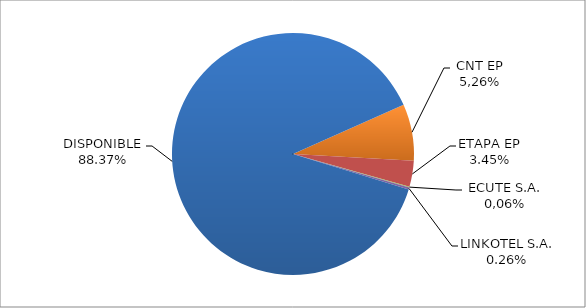
| Category | CODIGO DE AREA 7 |
|---|---|
| CORPORACIÓN NACIONAL TELECOMUNICACIONES CNT EP | 0.076 |
| ETAPA EP | 0.035 |
| CONECEL (ex ECUADORTELECOM S.A.) | 0.001 |
| LINKOTEL S.A. | 0.003 |
| DISPONIBLE | 0.884 |